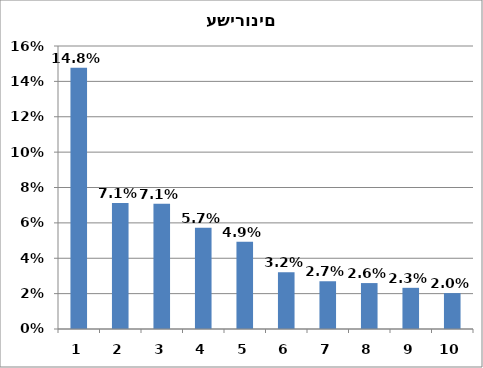
| Category | Series 0 |
|---|---|
| 1.0 | 0.148 |
| 2.0 | 0.071 |
| 3.0 | 0.071 |
| 4.0 | 0.057 |
| 5.0 | 0.049 |
| 6.0 | 0.032 |
| 7.0 | 0.027 |
| 8.0 | 0.026 |
| 9.0 | 0.023 |
| 10.0 | 0.02 |